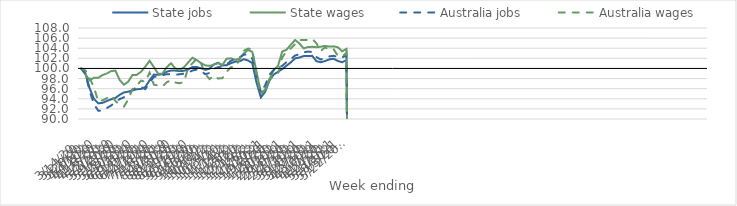
| Category | State jobs | State wages | Australia jobs | Australia wages |
|---|---|---|---|---|
| 14/03/2020 | 100 | 100 | 100 | 100 |
| 21/03/2020 | 99.013 | 98.826 | 98.971 | 99.605 |
| 28/03/2020 | 96.05 | 97.662 | 95.467 | 98.107 |
| 04/04/2020 | 93.974 | 98.179 | 92.92 | 96.258 |
| 11/04/2020 | 93.092 | 98.139 | 91.648 | 93.491 |
| 18/04/2020 | 93.198 | 98.697 | 91.631 | 93.694 |
| 25/04/2020 | 93.562 | 98.991 | 92.162 | 94.113 |
| 02/05/2020 | 93.893 | 99.481 | 92.658 | 94.675 |
| 09/05/2020 | 94.16 | 99.569 | 93.343 | 93.583 |
| 16/05/2020 | 94.779 | 97.719 | 93.936 | 92.817 |
| 23/05/2020 | 95.255 | 96.776 | 94.293 | 92.47 |
| 30/05/2020 | 95.412 | 97.384 | 94.8 | 93.82 |
| 06/06/2020 | 95.649 | 98.705 | 95.784 | 95.934 |
| 13/06/2020 | 95.899 | 98.728 | 96.283 | 96.613 |
| 20/06/2020 | 95.924 | 99.344 | 96.299 | 97.596 |
| 27/06/2020 | 96.346 | 100.358 | 95.908 | 97.351 |
| 04/07/2020 | 97.654 | 101.527 | 97.201 | 99.182 |
| 11/07/2020 | 98.785 | 100.254 | 98.328 | 96.791 |
| 18/07/2020 | 98.745 | 98.97 | 98.432 | 96.609 |
| 25/07/2020 | 98.882 | 98.964 | 98.653 | 96.408 |
| 01/08/2020 | 99.349 | 100.228 | 98.875 | 97.263 |
| 08/08/2020 | 99.588 | 101.037 | 98.872 | 97.698 |
| 15/08/2020 | 99.575 | 100.008 | 98.757 | 97.212 |
| 22/08/2020 | 99.48 | 99.683 | 98.844 | 97.073 |
| 29/08/2020 | 99.531 | 100.212 | 98.982 | 97.295 |
| 05/09/2020 | 99.803 | 101.172 | 99.167 | 100.035 |
| 12/09/2020 | 100.272 | 102.121 | 99.586 | 101.016 |
| 19/09/2020 | 100.279 | 101.658 | 99.757 | 101.878 |
| 26/09/2020 | 100.051 | 101.075 | 99.556 | 101.032 |
| 03/10/2020 | 99.721 | 100.612 | 98.852 | 98.907 |
| 10/10/2020 | 99.945 | 100.512 | 99.105 | 97.892 |
| 17/10/2020 | 100.774 | 100.739 | 99.955 | 98.589 |
| 24/10/2020 | 101.14 | 101.048 | 100.247 | 98.012 |
| 31/10/2020 | 100.592 | 100.662 | 100.384 | 98.084 |
| 07/11/2020 | 100.645 | 101.924 | 100.771 | 99.334 |
| 14/11/2020 | 101.033 | 102.003 | 101.516 | 100.252 |
| 21/11/2020 | 101.339 | 101.714 | 101.84 | 100.323 |
| 28/11/2020 | 101.4 | 101.957 | 102.16 | 101.68 |
| 05/12/2020 | 101.831 | 102.946 | 102.718 | 103.493 |
| 12/12/2020 | 101.574 | 103.657 | 102.789 | 103.93 |
| 19/12/2020 | 101.058 | 103.275 | 101.986 | 103.809 |
| 26/12/2020 | 97.176 | 99.315 | 98.188 | 98.338 |
| 02/01/2021 | 94.28 | 95.22 | 95.282 | 94.812 |
| 09/01/2021 | 95.36 | 95.777 | 96.645 | 95.793 |
| 16/01/2021 | 97.597 | 97.876 | 98.738 | 97.83 |
| 23/01/2021 | 98.78 | 99.686 | 99.703 | 98.519 |
| 30/01/2021 | 99.341 | 100.497 | 100.182 | 98.873 |
| 06/02/2021 | 99.884 | 103.348 | 100.516 | 102.171 |
| 13/02/2021 | 100.549 | 103.701 | 101.256 | 103.38 |
| 20/02/2021 | 101.203 | 104.681 | 101.855 | 103.943 |
| 27/02/2021 | 101.991 | 105.631 | 102.556 | 104.829 |
| 06/03/2021 | 102.163 | 104.948 | 102.809 | 105.611 |
| 13/03/2021 | 102.446 | 103.965 | 103.171 | 105.63 |
| 20/03/2021 | 102.445 | 104.236 | 103.339 | 105.616 |
| 27/03/2021 | 102.492 | 104.278 | 103.246 | 105.876 |
| 03/04/2021 | 101.427 | 104.204 | 102.251 | 104.958 |
| 10/04/2021 | 101.236 | 104.304 | 101.76 | 103.45 |
| 17/04/2021 | 101.457 | 104.456 | 102.161 | 104.184 |
| 24/04/2021 | 101.802 | 104.328 | 102.386 | 103.705 |
| 01/05/2021 | 101.919 | 104.37 | 102.495 | 103.842 |
| 08/05/2021 | 101.474 | 104.185 | 102.264 | 102.466 |
| 15/05/2021 | 101.226 | 103.388 | 102.191 | 102.371 |
| 22/05/2021 | 101.653 | 103.863 | 102.592 | 103.091 |